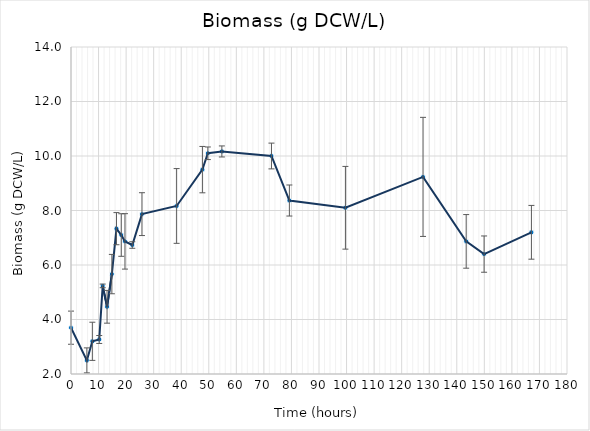
| Category | Series 0 |
|---|---|
| 0.0 | 3.7 |
| 5.750000000058208 | 2.5 |
| 7.749999999941792 | 3.2 |
| 10.250000000058208 | 3.267 |
| 11.499999999941792 | 5.233 |
| 13.083333333372138 | 4.467 |
| 14.83333333331393 | 5.667 |
| 16.5 | 7.333 |
| 18.249999999941792 | 7.1 |
| 19.583333333255723 | 6.867 |
| 22.250000000058208 | 6.733 |
| 25.749999999941792 | 7.867 |
| 38.33333333325572 | 8.167 |
| 47.683333333348855 | 9.5 |
| 49.66666666668607 | 10.1 |
| 54.75 | 10.167 |
| 72.75 | 10 |
| 79.25000000005821 | 8.367 |
| 99.58333333331393 | 8.1 |
| 127.74999999994179 | 9.233 |
| 143.41666666668607 | 6.867 |
| 149.91666666674428 | 6.4 |
| 167.08333333331393 | 7.2 |